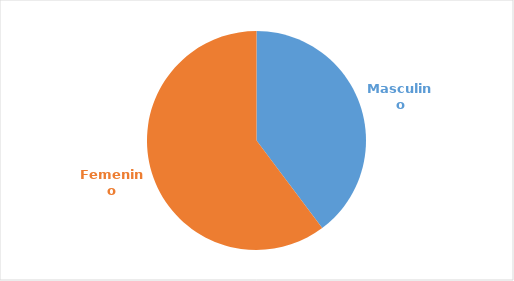
| Category | Series 0 |
|---|---|
| Masculino | 0.398 |
| Femenino | 0.603 |